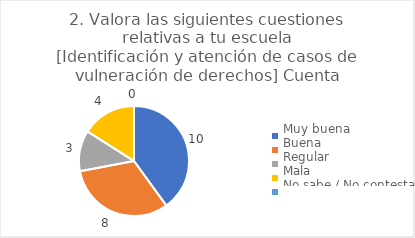
| Category | 2. Valora las siguientes cuestiones relativas a tu escuela
[Identificación y atención de casos de vulneración de derechos] |
|---|---|
| Muy buena  | 0.4 |
| Buena  | 0.32 |
| Regular  | 0.12 |
| Mala  | 0.16 |
| No sabe / No contesta | 0 |